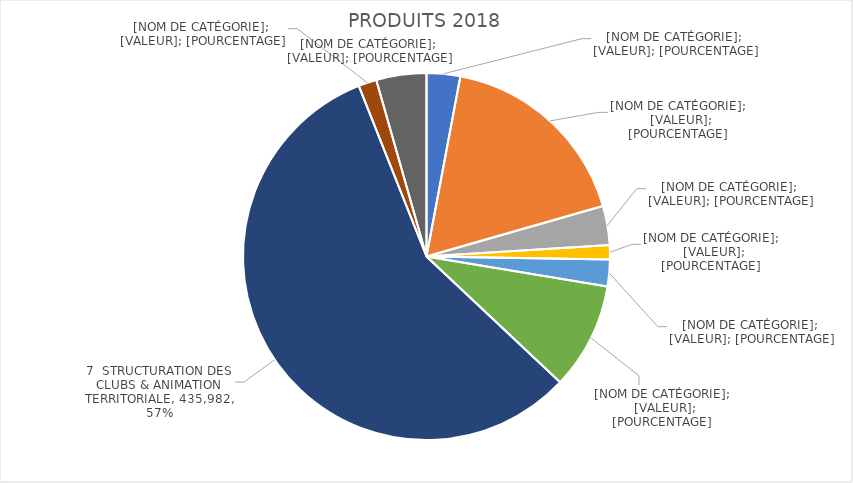
| Category | Series 0 |
|---|---|
| 1 ATHLETISME COMPETITION | 22639 |
| 2 SUIVI ATHLETES | 134763.088 |
| 3 ATHLETISME DES JEUNES | 26269.849 |
| 4 ATHLE HORS STADE | 9646.099 |
| 5 ATHLE SANTE LOISIRS | 18042.919 |
| 6 FORMATIONS | 71873.339 |
| 7  STRUCTURATION DES CLUBS & ANIMATION TERRITORIALE | 435981.546 |
| 8 STRUCTURE REGIONALE | 12234.898 |
| 9 ADMINISTRATION | 33770.532 |